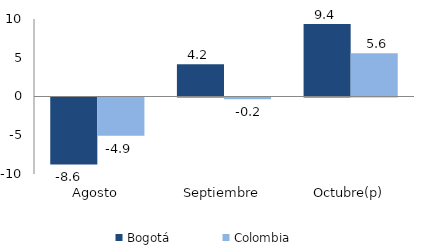
| Category | Bogotá | Colombia |
|---|---|---|
| Agosto | -8.633 | -4.937 |
| Septiembre | 4.154 | -0.237 |
| Octubre(p) | 9.37 | 5.58 |